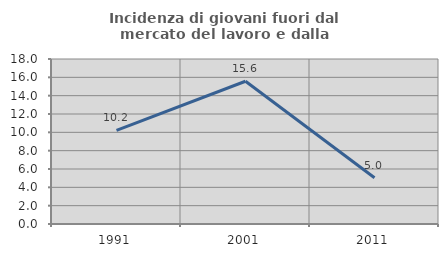
| Category | Incidenza di giovani fuori dal mercato del lavoro e dalla formazione  |
|---|---|
| 1991.0 | 10.204 |
| 2001.0 | 15.574 |
| 2011.0 | 5.042 |